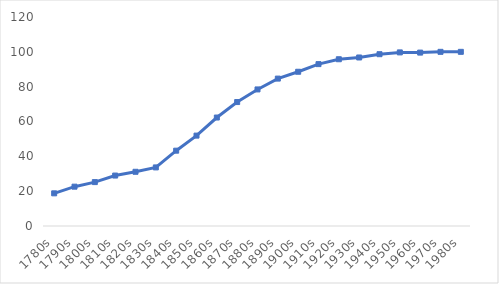
| Category | Series 0 |
|---|---|
| 1780s | 18.756 |
| 1790s | 22.586 |
| 1800s | 25.205 |
| 1810s | 28.962 |
| 1820s | 31.124 |
| 1830s | 33.638 |
| 1840s | 43.249 |
| 1850s | 51.899 |
| 1860s | 62.279 |
| 1870s | 71.168 |
| 1880s | 78.41 |
| 1890s | 84.63 |
| 1900s | 88.558 |
| 1910s | 92.948 |
| 1920s | 95.75 |
| 1930s | 96.759 |
| 1940s | 98.64 |
| 1950s | 99.676 |
| 1960s | 99.561 |
| 1970s | 100 |
| 1980s | 100 |